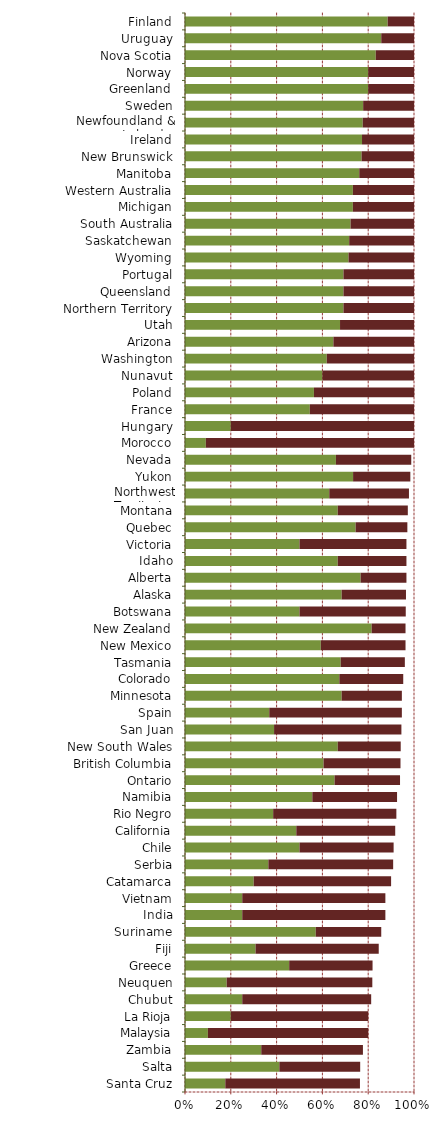
| Category |   Encourages Investment |   Not a Deterrent to Investment |
|---|---|---|
| Santa Cruz | 0.176 | 0.588 |
| Salta | 0.412 | 0.353 |
| Zambia | 0.333 | 0.444 |
| Malaysia | 0.1 | 0.7 |
| La Rioja | 0.2 | 0.6 |
| Chubut | 0.25 | 0.563 |
| Neuquen | 0.182 | 0.636 |
| Greece | 0.455 | 0.364 |
| Fiji | 0.308 | 0.538 |
| Suriname | 0.571 | 0.286 |
| India | 0.25 | 0.625 |
| Vietnam | 0.25 | 0.625 |
| Catamarca | 0.3 | 0.6 |
| Serbia | 0.364 | 0.545 |
| Chile | 0.5 | 0.411 |
| California | 0.486 | 0.432 |
| Rio Negro | 0.385 | 0.538 |
| Namibia | 0.556 | 0.37 |
| Ontario | 0.653 | 0.286 |
| British Columbia | 0.605 | 0.336 |
| New South Wales | 0.667 | 0.275 |
| San Juan | 0.389 | 0.556 |
| Spain | 0.368 | 0.579 |
| Minnesota | 0.684 | 0.263 |
| Colorado | 0.674 | 0.279 |
| Tasmania | 0.68 | 0.28 |
| New Mexico | 0.593 | 0.37 |
| New Zealand | 0.815 | 0.148 |
| Botswana | 0.5 | 0.464 |
| Alaska | 0.684 | 0.281 |
| Alberta | 0.767 | 0.2 |
| Idaho | 0.667 | 0.3 |
| Victoria | 0.5 | 0.467 |
| Quebec | 0.745 | 0.226 |
| Montana | 0.667 | 0.306 |
| Northwest Territories | 0.63 | 0.348 |
| Yukon | 0.734 | 0.25 |
| Nevada | 0.659 | 0.329 |
| Morocco | 0.091 | 0.909 |
| Hungary | 0.2 | 0.8 |
| France | 0.545 | 0.455 |
| Poland | 0.563 | 0.438 |
| Nunavut | 0.6 | 0.4 |
| Washington | 0.619 | 0.381 |
| Arizona | 0.648 | 0.352 |
| Utah | 0.677 | 0.323 |
| Northern Territory | 0.692 | 0.308 |
| Queensland | 0.692 | 0.308 |
| Portugal | 0.692 | 0.308 |
| Wyoming | 0.714 | 0.286 |
| Saskatchewan | 0.717 | 0.283 |
| South Australia | 0.723 | 0.277 |
| Michigan | 0.733 | 0.267 |
| Western Australia | 0.733 | 0.267 |
| Manitoba | 0.761 | 0.239 |
| New Brunswick | 0.771 | 0.229 |
| Ireland | 0.773 | 0.227 |
| Newfoundland & Labrador | 0.776 | 0.224 |
| Sweden | 0.778 | 0.222 |
| Greenland | 0.8 | 0.2 |
| Norway | 0.8 | 0.2 |
| Nova Scotia | 0.833 | 0.167 |
| Uruguay | 0.857 | 0.143 |
| Finland | 0.885 | 0.115 |